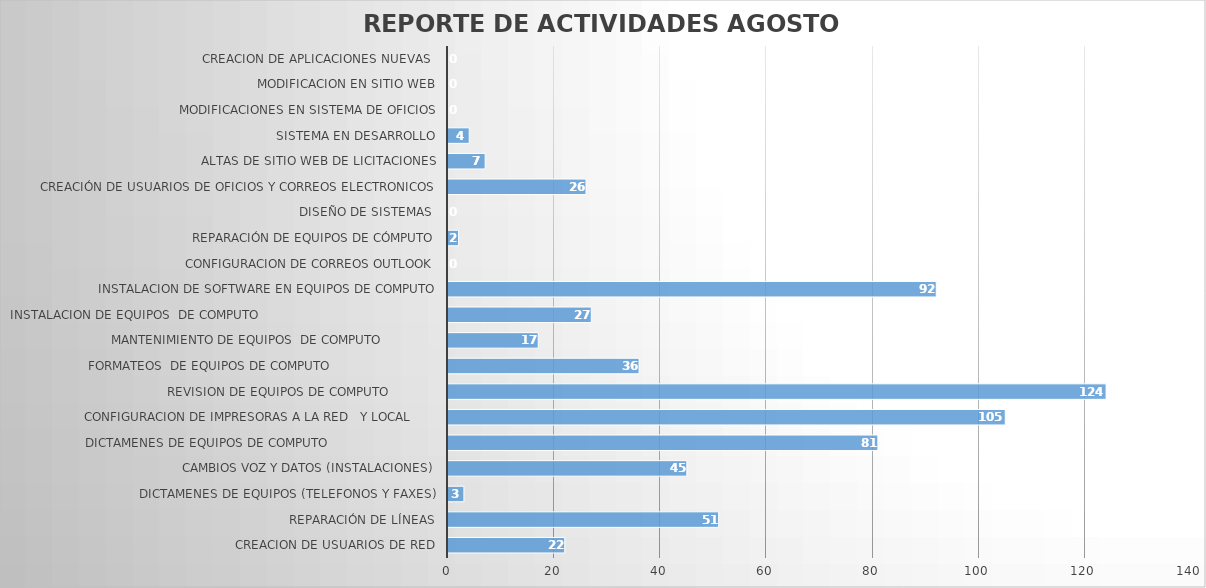
| Category | ago-22 |
|---|---|
| CREACION DE USUARIOS DE RED | 22 |
| REPARACIÓN DE LÍNEAS | 51 |
| DICTAMENES DE EQUIPOS (TELEFONOS Y FAXES) | 3 |
| CAMBIOS VOZ Y DATOS (INSTALACIONES) | 45 |
| DICTAMENES DE EQUIPOS DE COMPUTO                             | 81 |
| CONFIGURACION DE IMPRESORAS A LA RED   Y LOCAL       | 105 |
| REVISION DE EQUIPOS DE COMPUTO             | 124 |
| FORMATEOS  DE EQUIPOS DE COMPUTO                            | 36 |
| MANTENIMIENTO DE EQUIPOS  DE COMPUTO               | 17 |
| INSTALACION DE EQUIPOS  DE COMPUTO                                               | 27 |
| INSTALACION DE SOFTWARE EN EQUIPOS DE COMPUTO | 92 |
| CONFIGURACION DE CORREOS OUTLOOK | 0 |
| REPARACIÓN DE EQUIPOS DE CÓMPUTO | 2 |
| DISEÑO DE SISTEMAS  | 0 |
| CREACIÓN DE USUARIOS DE OFICIOS Y CORREOS ELECTRONICOS | 26 |
| ALTAS DE SITIO WEB DE LICITACIONES | 7 |
| SISTEMA EN DESARROLLO | 4 |
| MODIFICACIONES EN SISTEMA DE OFICIOS | 0 |
| MODIFICACION EN SITIO WEB | 0 |
| CREACION DE APLICACIONES NUEVAS  | 0 |